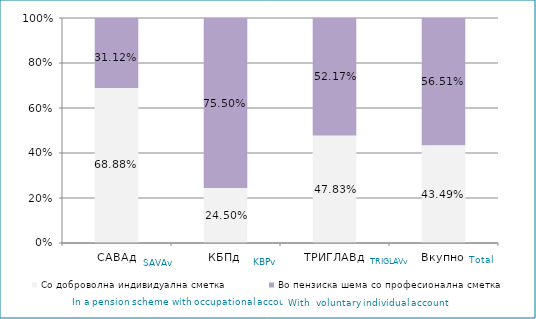
| Category | Со доброволна индивидуална сметка  | Во пензиска шема со професионална сметка |
|---|---|---|
| САВАд | 0.689 | 0.311 |
| КБПд | 0.245 | 0.755 |
| ТРИГЛАВд | 0.478 | 0.522 |
| Вкупно | 0.435 | 0.565 |